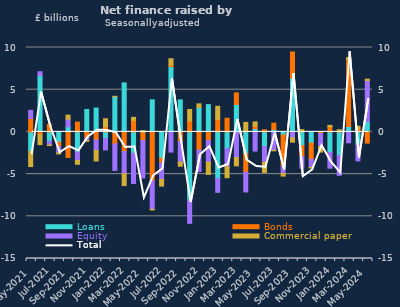
| Category | Loans | Bonds | Equity | Commercial paper |
|---|---|---|---|---|
| May-2021 | -2.29 | 1.596 | 0.957 | -1.817 |
| Jun-2021 | 6.682 | -0.338 | 0.451 | -1.166 |
| Jul-2021 | -1.105 | 0.867 | -0.444 | -0.072 |
| Aug-2021 | -1.229 | -0.499 | -0.748 | -0.136 |
| Sep-2021 | 0.602 | -3.026 | 0.903 | 0.481 |
| Oct-2021 | -2.387 | 1.158 | -1.004 | -0.446 |
| Nov-2021 | 2.65 | -0.729 | -0.282 | -0.107 |
| Dec-2021 | 2.821 | -0.957 | -1.236 | -1.25 |
| Jan-2022 | -0.772 | 0.598 | -1.367 | 0.961 |
| Feb-2022 | 4.164 | -1.431 | -3.129 | 0.058 |
| Mar-2022 | 5.803 | -2.323 | -2.63 | -1.403 |
| Apr-2022 | -2.536 | 1.362 | -3.57 | 0.359 |
| May-2022 | -0.083 | -0.942 | -4.43 | 0.142 |
| Jun-2022 | 3.801 | -5.816 | -3.354 | -0.081 |
| Jul-2022 | -3.125 | -0.555 | -1.949 | -0.789 |
| Aug-2022 | 7.752 | 0.173 | -2.392 | 0.742 |
| Sep-2022 | 3.795 | -1.135 | -2.444 | -0.495 |
| Oct-2022 | -8.072 | 1.304 | -2.765 | 1.347 |
| Nov-2022 | 2.865 | -2.15 | -2.532 | 0.46 |
| Dec-2022 | 3.231 | -1.032 | -2.55 | -1.457 |
| Jan-2023 | -5.529 | 1.488 | -1.632 | 1.544 |
| Feb-2023 | -1.961 | 1.616 | -2.162 | -1.306 |
| Mar-2023 | 3.247 | 1.375 | -3.047 | -0.973 |
| Apr-2023 | -2.565 | -2.212 | -2.337 | 1.122 |
| May-2023 | 0.382 | 0.298 | -2.271 | 0.503 |
| Jun-2023 | -1.735 | 0.244 | -1.865 | -1.198 |
| Jul-2023 | 0.278 | 0.754 | -2.187 | -0.052 |
| Aug-2023 | -0.357 | -3.733 | -0.833 | -0.312 |
| Sep-2023 | 6.359 | 3.109 | -0.702 | -0.512 |
| Oct-2023 | -1.625 | -1.306 | -1.374 | 0.267 |
| Nov-2023 | -1.318 | -1.935 | -0.946 | -0.066 |
| Dec-2023 | -0.04 | -0.156 | -1.539 | -0.653 |
| Jan-2024 | -2.438 | 0.609 | -1.861 | 0.167 |
| Feb-2024 | -2.812 | 0.021 | -2.334 | 0.241 |
| Mar-2024 | 0.643 | 7.96 | -1.291 | 0.208 |
| Apr-2024 | -1.472 | 0.348 | -1.96 | 0.315 |
| May-2024 | 1.211 | -1.327 | 4.877 | 0.161 |